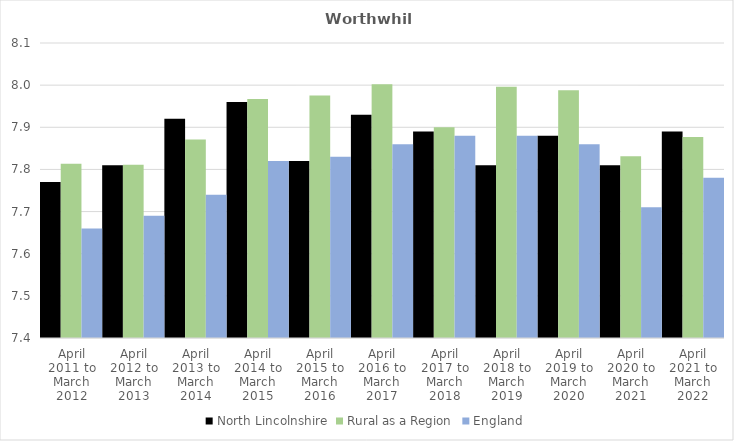
| Category | North Lincolnshire | Rural as a Region | England |
|---|---|---|---|
| April 2011 to March 2012 | 7.77 | 7.813 | 7.66 |
| April 2012 to March 2013 | 7.81 | 7.811 | 7.69 |
| April 2013 to March 2014 | 7.92 | 7.871 | 7.74 |
| April 2014 to March 2015 | 7.96 | 7.967 | 7.82 |
| April 2015 to March 2016 | 7.82 | 7.975 | 7.83 |
| April 2016 to March 2017 | 7.93 | 8.002 | 7.86 |
| April 2017 to March 2018 | 7.89 | 7.9 | 7.88 |
| April 2018 to March 2019 | 7.81 | 7.996 | 7.88 |
| April 2019 to March 2020 | 7.88 | 7.988 | 7.86 |
| April 2020 to March 2021 | 7.81 | 7.831 | 7.71 |
| April 2021 to March 2022 | 7.89 | 7.877 | 7.78 |